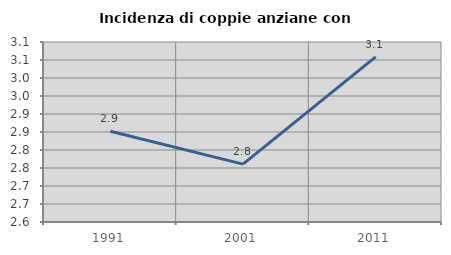
| Category | Incidenza di coppie anziane con figli |
|---|---|
| 1991.0 | 2.852 |
| 2001.0 | 2.761 |
| 2011.0 | 3.059 |